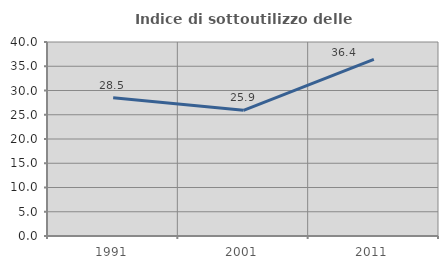
| Category | Indice di sottoutilizzo delle abitazioni  |
|---|---|
| 1991.0 | 28.515 |
| 2001.0 | 25.917 |
| 2011.0 | 36.408 |